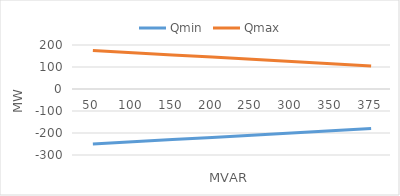
| Category | Qmin | Qmax |
|---|---|---|
| 50.0 | -250 | 175 |
| 100.0 | -240 | 165 |
| 150.0 | -230 | 155 |
| 200.0 | -220 | 145 |
| 250.0 | -210 | 135 |
| 300.0 | -200 | 125 |
| 350.0 | -190 | 115 |
| 375.0 | -180 | 105 |